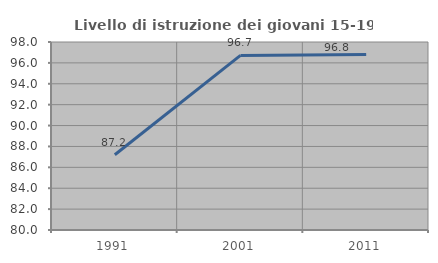
| Category | Livello di istruzione dei giovani 15-19 anni |
|---|---|
| 1991.0 | 87.202 |
| 2001.0 | 96.713 |
| 2011.0 | 96.813 |